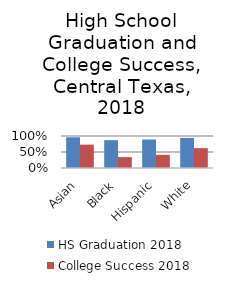
| Category | HS Graduation 2018 | College Success 2018 |
|---|---|---|
| Asian | 0.96 | 0.73 |
| Black | 0.87 | 0.34 |
| Hispanic | 0.89 | 0.41 |
| White | 0.94 | 0.62 |